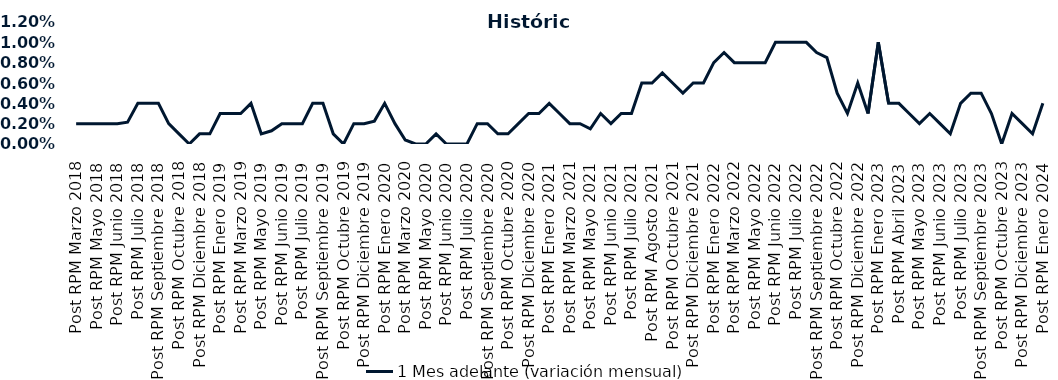
| Category | 1 Mes adelante (variación mensual) |
|---|---|
| Post RPM Marzo 2018 | 0.002 |
| Pre RPM Mayo 2018 | 0.002 |
| Post RPM Mayo 2018 | 0.002 |
| Pre RPM Junio 2018 | 0.002 |
| Post RPM Junio 2018 | 0.002 |
| Pre RPM Julio 2018 | 0.002 |
| Post RPM Julio 2018 | 0.004 |
| Pre RPM Septiembre 2018 | 0.004 |
| Post RPM Septiembre 2018 | 0.004 |
| Pre RPM Octubre 2018 | 0.002 |
| Post RPM Octubre 2018 | 0.001 |
| Pre RPM Diciembre 2018 | 0 |
| Post RPM Diciembre 2018 | 0.001 |
| Pre RPM Enero 2019 | 0.001 |
| Post RPM Enero 2019 | 0.003 |
| Pre RPM Marzo 2019 | 0.003 |
| Post RPM Marzo 2019 | 0.003 |
| Pre RPM Mayo 2019 | 0.004 |
| Post RPM Mayo 2019 | 0.001 |
| Pre RPM Junio 2019 | 0.001 |
| Post RPM Junio 2019 | 0.002 |
| Pre RPM Julio 2019 | 0.002 |
| Post RPM Julio 2019 | 0.002 |
| Pre RPM Septiembre 2019 | 0.004 |
| Post RPM Septiembre 2019 | 0.004 |
| Pre RPM Octubre 2019 | 0.001 |
| Post RPM Octubre 2019 | 0 |
| Pre RPM Diciembre 2019 | 0.002 |
| Post RPM Diciembre 2019 | 0.002 |
| Pre RPM Enero 2020 | 0.002 |
| Post RPM Enero 2020 | 0.004 |
| Pre RPM Marzo 2020 | 0.002 |
| Post RPM Marzo 2020 | 0 |
| Pre RPM Mayo 2020 | 0 |
| Post RPM Mayo 2020 | 0 |
| Pre RPM Junio 2020 | 0.001 |
| Post RPM Junio 2020 | 0 |
| Pre RPM Julio 2020 | 0 |
| Post RPM Julio 2020 | 0 |
| Pre RPM Septiembre 2020 | 0.002 |
| Post RPM Septiembre 2020 | 0.002 |
| Pre RPM Octubre 2020 | 0.001 |
| Post RPM Octubre 2020 | 0.001 |
| Pre RPM Diciembre 2020 | 0.002 |
| Post RPM Diciembre 2020 | 0.003 |
| Pre RPM Enero 2021 | 0.003 |
| Post RPM Enero 2021 | 0.004 |
| Pre RPM Marzo 2021 | 0.003 |
| Post RPM Marzo 2021 | 0.002 |
| Pre RPM Mayo 2021 | 0.002 |
| Post RPM Mayo 2021 | 0.002 |
| Pre RPM Junio 2021 | 0.003 |
| Post RPM Junio 2021 | 0.002 |
| Pre RPM Julio 2021 | 0.003 |
| Post RPM Julio 2021 | 0.003 |
| Pre RPM Agosto 2021 | 0.006 |
| Post RPM Agosto 2021 | 0.006 |
| Pre RPM Octubre 2021 | 0.007 |
| Post RPM Octubre 2021 | 0.006 |
| Pre RPM Diciembre 2021 | 0.005 |
| Post RPM Diciembre 2021 | 0.006 |
| Pre RPM Enero 2022 | 0.006 |
| Post RPM Enero 2022 | 0.008 |
| Pre RPM Marzo 2022 | 0.009 |
| Post RPM Marzo 2022 | 0.008 |
| Pre RPM Mayo 2022 | 0.008 |
| Post RPM Mayo 2022 | 0.008 |
| Pre RPM Junio 2022 | 0.008 |
| Post RPM Junio 2022 | 0.01 |
| Pre RPM Julio 2022 | 0.01 |
| Post RPM Julio 2022 | 0.01 |
| Pre RPM Septiembre 2022 | 0.01 |
| Post RPM Septiembre 2022 | 0.009 |
| Pre RPM Octubre 2022 | 0.008 |
| Post RPM Octubre 2022 | 0.005 |
| Pre RPM Diciembre 2022 | 0.003 |
| Post RPM Diciembre 2022 | 0.006 |
| Pre RPM Enero 2023 | 0.003 |
| Post RPM Enero 2023 | 0.01 |
| Pre RPM Abril 2023 | 0.004 |
| Post RPM Abril 2023 | 0.004 |
| Pre RPM Mayo 2023 | 0.003 |
| Post RPM Mayo 2023 | 0.002 |
| Pre RPM Junio 2023 | 0.003 |
| Post RPM Junio 2023 | 0.002 |
| Pre RPM Julio 2023 | 0.001 |
| Post RPM Julio 2023 | 0.004 |
| Pre RPM Septiembre 2023 | 0.005 |
| Post RPM Septiembre 2023 | 0.005 |
| Pre RPM Octubre 2023 | 0.003 |
| Post RPM Octubre 2023 | 0 |
| Pre RPM Diciembre 2023 | 0.003 |
| Post RPM Diciembre 2023 | 0.002 |
| Pre RPM Enero 2024 | 0.001 |
| Post RPM Enero 2024 | 0.004 |